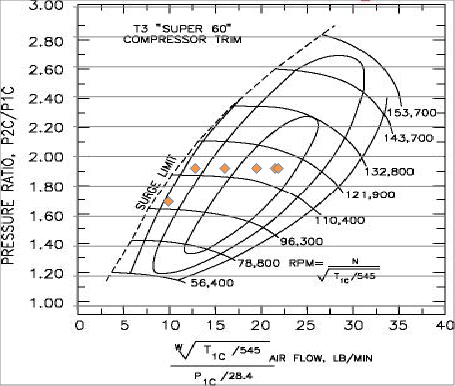
| Category | Series 0 |
|---|---|
| 9.97712521359251 | 1.7 |
| 12.891725741292444 | 1.92 |
| 16.114657176615555 | 1.92 |
| 19.576324273814446 | 1.92 |
| 21.599609008211736 | 1.92 |
| 21.933838934837834 | 1.92 |